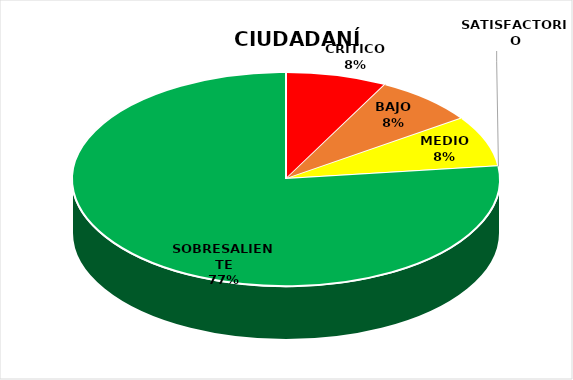
| Category | Series 0 |
|---|---|
| CRÍTICO | 1 |
| BAJO | 1 |
| MEDIO | 1 |
| SATISFACTORIO | 0 |
| SOBRESALIENTE | 10 |